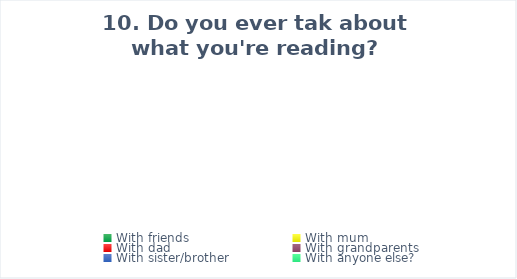
| Category | Series 0 |
|---|---|
| With friends | 0 |
| With mum | 0 |
| With dad | 0 |
| With grandparents | 0 |
| With sister/brother | 0 |
| With anyone else? | 0 |